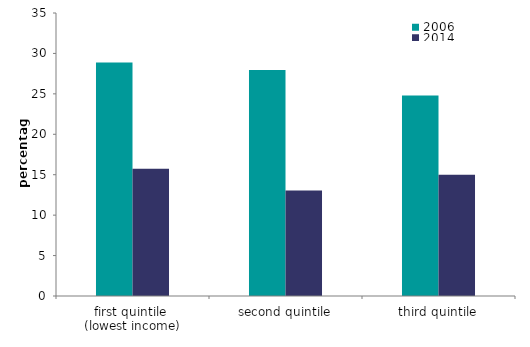
| Category | 2006 | 2014 |
|---|---|---|
| first quintile 
(lowest income) | 28.887 | 15.743 |
| second quintile | 27.953 | 13.033 |
| third quintile | 24.783 | 15.01 |